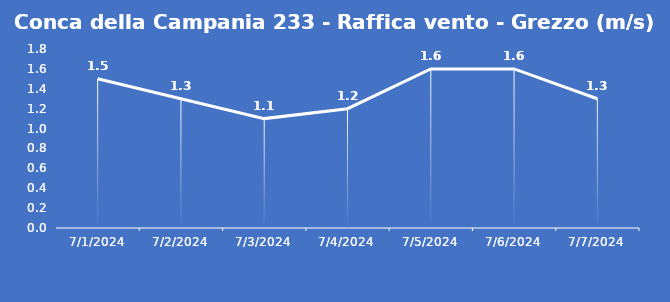
| Category | Conca della Campania 233 - Raffica vento - Grezzo (m/s) |
|---|---|
| 7/1/24 | 1.5 |
| 7/2/24 | 1.3 |
| 7/3/24 | 1.1 |
| 7/4/24 | 1.2 |
| 7/5/24 | 1.6 |
| 7/6/24 | 1.6 |
| 7/7/24 | 1.3 |